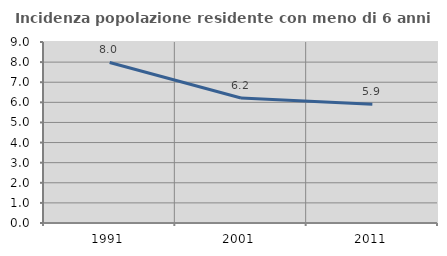
| Category | Incidenza popolazione residente con meno di 6 anni |
|---|---|
| 1991.0 | 7.983 |
| 2001.0 | 6.217 |
| 2011.0 | 5.907 |